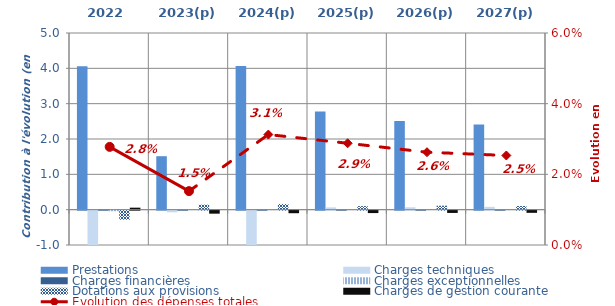
| Category | Prestations | Charges techniques | Charges financières | Charges exceptionnelles | Dotations aux provisions | Charges de gestion courante |
|---|---|---|---|---|---|---|
| 2022 | 4.06 | -1.073 | 0.009 | -0.016 | -0.259 | 0.056 |
| 2023(p) | 1.513 | -0.046 | 0 | 0 | 0.142 | -0.085 |
| 2024(p) | 4.069 | -1.034 | 0 | 0 | 0.162 | -0.072 |
| 2025(p) | 2.782 | 0.065 | 0 | 0 | 0.101 | -0.068 |
| 2026(p) | 2.511 | 0.068 | 0 | 0 | 0.112 | -0.064 |
| 2027(p) | 2.412 | 0.079 | 0 | 0 | 0.103 | -0.061 |